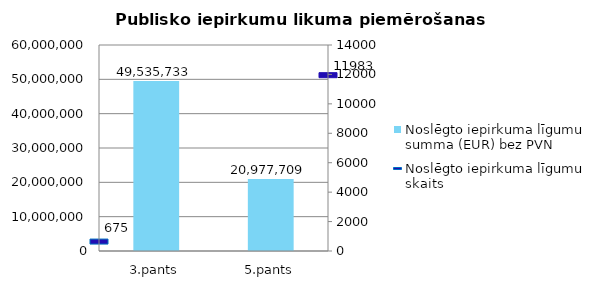
| Category | Noslēgto iepirkuma līgumu summa (EUR) bez PVN |
|---|---|
| 3.pants | 49535733 |
| 5.pants | 20977709 |